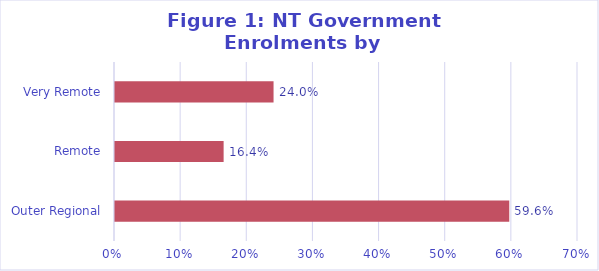
| Category | Series 0 |
|---|---|
| Outer Regional | 0.596 |
| Remote | 0.164 |
| Very Remote | 0.24 |